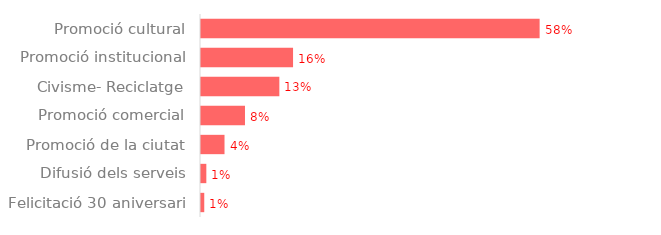
| Category | Series 0 |
|---|---|
| Promoció cultural | 20748.84 |
| Promoció institucional | 5640.45 |
| Civisme- Reciclatge | 4800.56 |
| Promoció comercial | 2695.3 |
| Promoció de la ciutat | 1441.114 |
| Difusió dels serveis | 326.7 |
| Felicitació 30 aniversari | 199.65 |